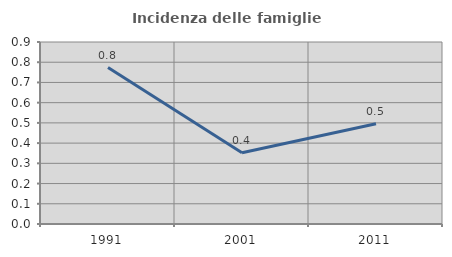
| Category | Incidenza delle famiglie numerose |
|---|---|
| 1991.0 | 0.774 |
| 2001.0 | 0.352 |
| 2011.0 | 0.496 |